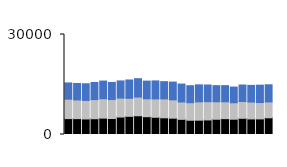
| Category | West Online | West Store | West Phone |
|---|---|---|---|
| 0 | 4774 | 5816 | 4884 |
| 1 | 4763 | 5609 | 4927 |
| 2 | 4664 | 5561 | 5001 |
| 3 | 4734 | 5733 | 5144 |
| 4 | 4907 | 5822 | 5305 |
| 5 | 4803 | 5676 | 5135 |
| 6 | 5236 | 5687 | 5151 |
| 7 | 5449 | 5412 | 5500 |
| 8 | 5619 | 5600 | 5526 |
| 9 | 5340 | 5372 | 5303 |
| 10 | 5162 | 5511 | 5403 |
| 11 | 5004 | 5674 | 5178 |
| 12 | 4896 | 5503 | 5327 |
| 13 | 4551 | 5213 | 5369 |
| 14 | 4273 | 5264 | 5097 |
| 15 | 4295 | 5508 | 5090 |
| 16 | 4373 | 5480 | 5002 |
| 17 | 4581 | 5227 | 4847 |
| 18 | 4754 | 5061 | 4847 |
| 19 | 4588 | 4930 | 4707 |
| 20 | 4857 | 5035 | 4956 |
| 21 | 4676 | 5057 | 5002 |
| 22 | 4680 | 4905 | 5213 |
| 23 | 5010 | 4770 | 5135 |